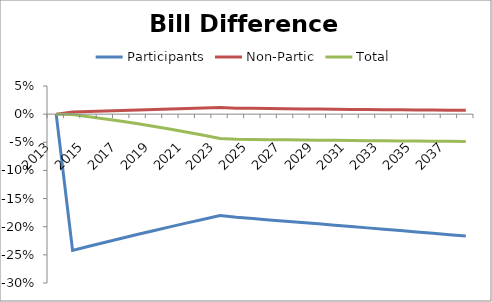
| Category | Participants | Non-Partic | Total |
|---|---|---|---|
| 2013.0 | 0 | 0 | 0 |
| 2014.0 | -0.242 | 0.004 | -0.001 |
| 2015.0 | -0.235 | 0.005 | -0.005 |
| 2016.0 | -0.228 | 0.006 | -0.009 |
| 2017.0 | -0.221 | 0.007 | -0.013 |
| 2018.0 | -0.214 | 0.007 | -0.017 |
| 2019.0 | -0.207 | 0.008 | -0.022 |
| 2020.0 | -0.2 | 0.009 | -0.027 |
| 2021.0 | -0.193 | 0.01 | -0.032 |
| 2022.0 | -0.187 | 0.011 | -0.038 |
| 2023.0 | -0.18 | 0.012 | -0.043 |
| 2024.0 | -0.183 | 0.011 | -0.045 |
| 2025.0 | -0.186 | 0.01 | -0.045 |
| 2026.0 | -0.188 | 0.01 | -0.045 |
| 2027.0 | -0.19 | 0.01 | -0.046 |
| 2028.0 | -0.193 | 0.009 | -0.046 |
| 2029.0 | -0.195 | 0.009 | -0.046 |
| 2030.0 | -0.197 | 0.009 | -0.047 |
| 2031.0 | -0.2 | 0.008 | -0.047 |
| 2032.0 | -0.202 | 0.008 | -0.047 |
| 2033.0 | -0.204 | 0.008 | -0.047 |
| 2034.0 | -0.207 | 0.008 | -0.048 |
| 2035.0 | -0.209 | 0.007 | -0.048 |
| 2036.0 | -0.212 | 0.007 | -0.048 |
| 2037.0 | -0.214 | 0.007 | -0.048 |
| 2038.0 | -0.217 | 0.007 | -0.049 |